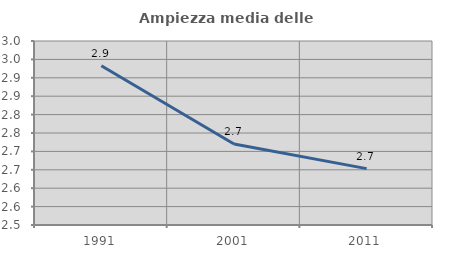
| Category | Ampiezza media delle famiglie |
|---|---|
| 1991.0 | 2.933 |
| 2001.0 | 2.72 |
| 2011.0 | 2.653 |